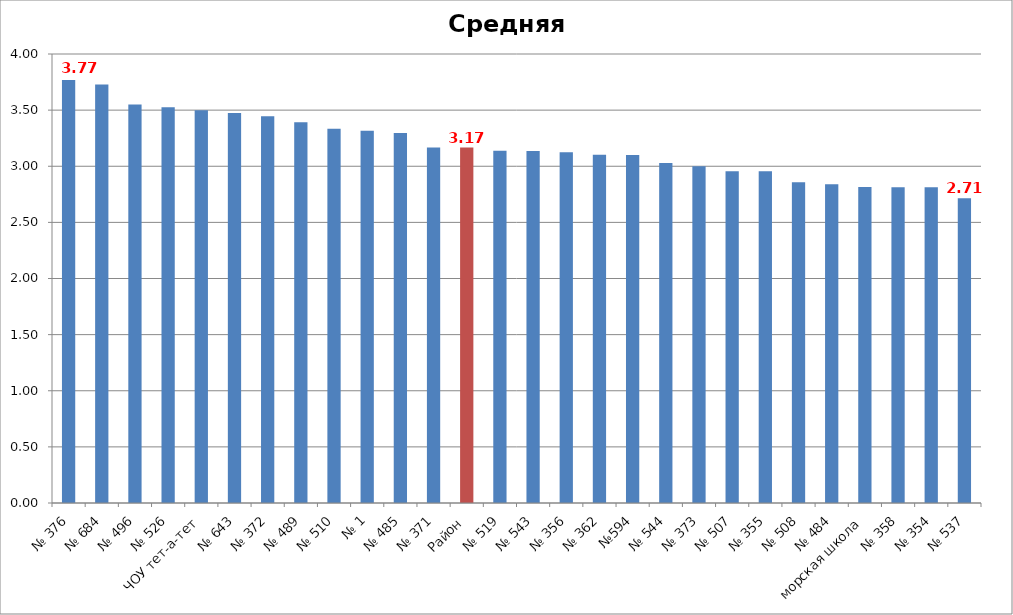
| Category | Средняя отметка |
|---|---|
| № 376 | 3.769 |
| № 684 | 3.727 |
| № 496 | 3.55 |
| № 526 | 3.526 |
| ЧОУ тет-а-тет | 3.5 |
| № 643 | 3.474 |
| № 372 | 3.444 |
| № 489 | 3.391 |
| № 510 | 3.333 |
| № 1 | 3.316 |
| № 485 | 3.296 |
| № 371 | 3.167 |
| Район | 3.166 |
| № 519 | 3.138 |
| № 543 | 3.136 |
| № 356 | 3.125 |
| № 362 | 3.103 |
| №594 | 3.1 |
| № 544 | 3.03 |
| № 373 | 3 |
| № 507 | 2.957 |
| № 355 | 2.955 |
| № 508 | 2.857 |
| № 484 | 2.84 |
| морская школа | 2.816 |
| № 358 | 2.814 |
| № 354 | 2.812 |
| № 537 | 2.714 |